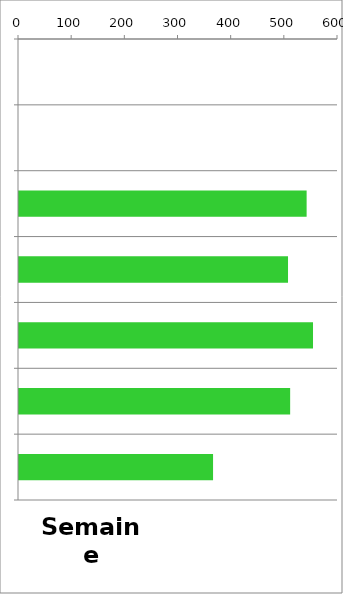
| Category | TV |
|---|---|
| 0 | 0 |
| 1 | 0 |
| 2 | 541 |
| 3 | 506 |
| 4 | 553 |
| 5 | 510 |
| 6 | 365 |